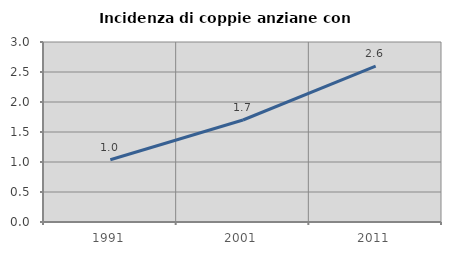
| Category | Incidenza di coppie anziane con figli |
|---|---|
| 1991.0 | 1.037 |
| 2001.0 | 1.7 |
| 2011.0 | 2.597 |